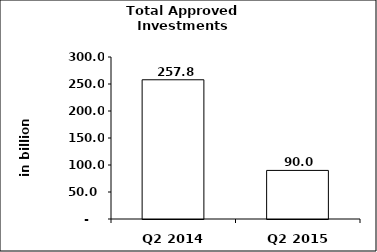
| Category | Series 0 |
|---|---|
| Q2 2014 | 257.827 |
| Q2 2015 | 89.975 |